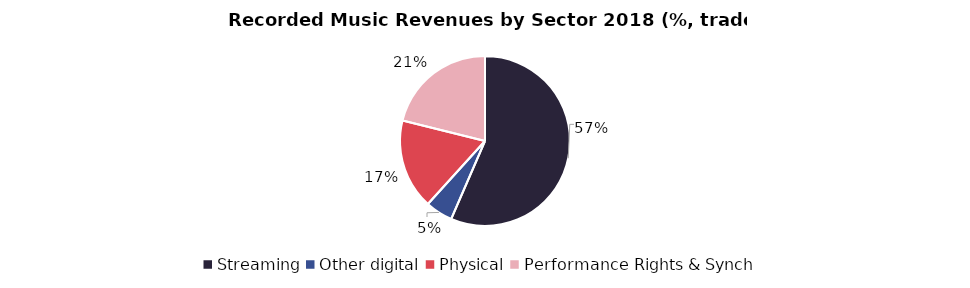
| Category | Series 0 |
|---|---|
| Streaming | 38.327 |
| Other digital | 3.535 |
| Physical | 11.639 |
| Performance Rights & Synch | 14.325 |